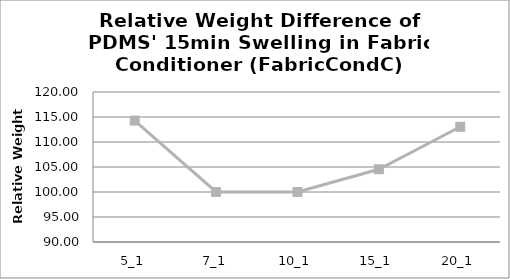
| Category | Relative weight (%) |
|---|---|
| 5_1 | 114.286 |
| 7_1 | 100 |
| 10_1 | 100 |
| 15_1 | 104.545 |
| 20_1 | 113.043 |